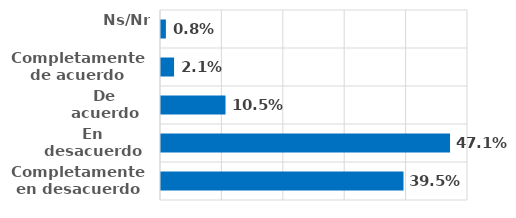
| Category | Series 0 |
|---|---|
| Completamente en desacuerdo | 0.395 |
| En desacuerdo | 0.471 |
| De acuerdo | 0.105 |
| Completamente de acuerdo | 0.021 |
| Ns/Nr | 0.008 |